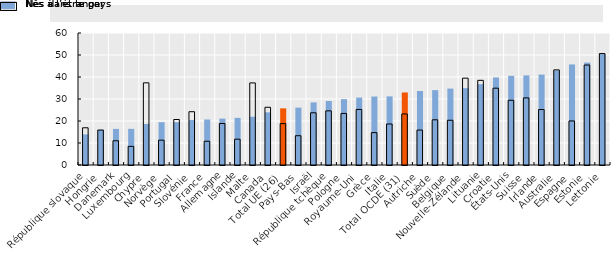
| Category | Nés à l’étranger | Nés dans le pays  |
|---|---|---|
| République slovaque | 13.916 | 16.916 |
| Hongrie | 16.027 | 15.883 |
| Danemark | 16.401 | 11.019 |
| Luxembourg | 16.427 | 8.463 |
| Chypre | 18.639 | 37.348 |
| Norvège | 19.463 | 11.291 |
| Portugal | 19.467 | 20.677 |
| Slovénie | 20.441 | 24.223 |
| France | 20.685 | 10.793 |
| Allemagne | 21.084 | 18.867 |
| Islande | 21.432 | 11.73 |
| Malte | 21.913 | 37.314 |
| Canada | 23.947 | 26.239 |
| Total UE (26) | 25.747 | 18.82 |
| Pays-Bas | 26.087 | 13.303 |
| Israël | 28.45 | 23.73 |
| République tchèque | 29.108 | 24.602 |
| Pologne | 29.939 | 23.44 |
| Royaume-Uni | 30.638 | 25.26 |
| Grèce | 31.123 | 14.727 |
| Italie | 31.187 | 18.643 |
| Total OCDE (31) | 32.968 | 23.197 |
| Autriche | 33.625 | 15.887 |
| Suède | 34.038 | 20.544 |
| Belgique | 34.737 | 20.341 |
| Nouvelle-Zélande | 34.916 | 39.477 |
| Lituanie | 36.754 | 38.481 |
| Croatie | 39.816 | 34.917 |
| États-Unis | 40.54 | 29.42 |
| Suisse | 40.73 | 30.507 |
| Irlande | 41.095 | 25.201 |
| Australie | 42.936 | 43.235 |
| Espagne | 45.713 | 20.027 |
| Estonie | 46.535 | 45.444 |
| Lettonie | 50.409 | 50.65 |